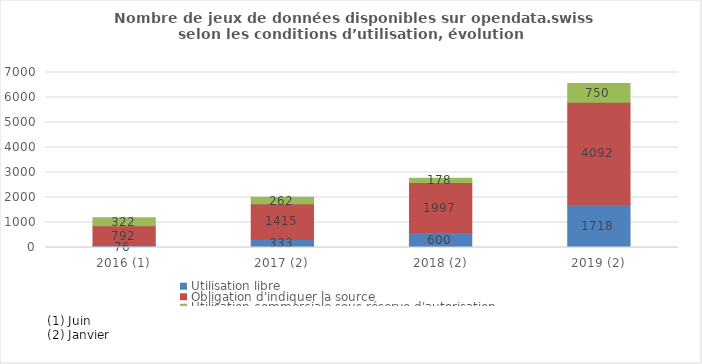
| Category | Utilisation libre | Obligation d'indiquer la source | Utilisation commerciale sous réserve d'autorisation |
|---|---|---|---|
| 2016 (1) | 76 | 792 | 322 |
| 2017 (2) | 333 | 1415 | 262 |
| 2018 (2) | 600 | 1997 | 178 |
| 2019 (2) | 1718 | 4092 | 750 |